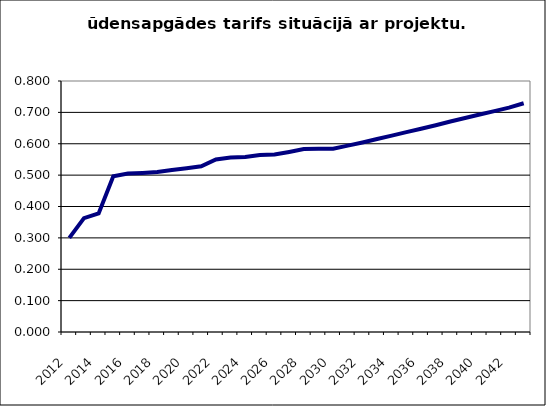
| Category | Series 0 |
|---|---|
| 2012.0 | 0.3 |
| 2013.0 | 0.363 |
| 2014.0 | 0.378 |
| 2015.0 | 0.496 |
| 2016.0 | 0.505 |
| 2017.0 | 0.507 |
| 2018.0 | 0.51 |
| 2019.0 | 0.516 |
| 2020.0 | 0.522 |
| 2021.0 | 0.528 |
| 2022.0 | 0.55 |
| 2023.0 | 0.556 |
| 2024.0 | 0.558 |
| 2025.0 | 0.564 |
| 2026.0 | 0.566 |
| 2027.0 | 0.574 |
| 2028.0 | 0.583 |
| 2029.0 | 0.584 |
| 2030.0 | 0.584 |
| 2031.0 | 0.594 |
| 2032.0 | 0.604 |
| 2033.0 | 0.615 |
| 2034.0 | 0.626 |
| 2035.0 | 0.637 |
| 2036.0 | 0.648 |
| 2037.0 | 0.659 |
| 2038.0 | 0.671 |
| 2039.0 | 0.682 |
| 2040.0 | 0.693 |
| 2041.0 | 0.704 |
| 2042.0 | 0.715 |
| 2043.0 | 0.729 |